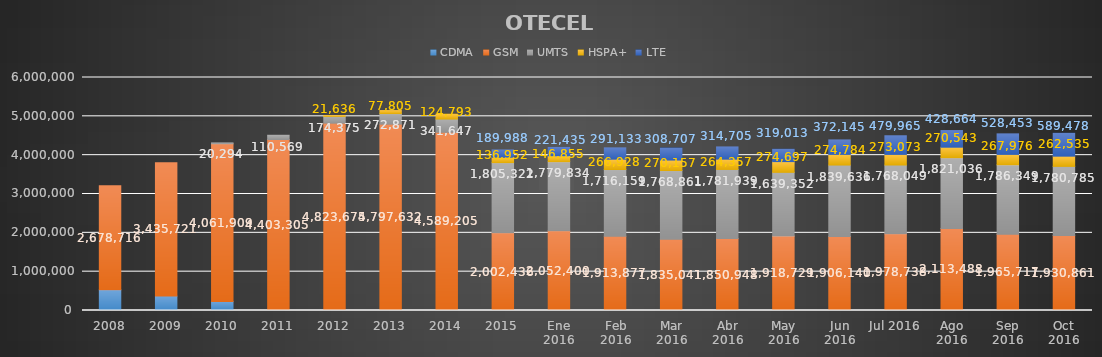
| Category | CDMA | GSM | UMTS | HSPA+ | LTE |
|---|---|---|---|---|---|
| 2008 | 533206 | 2678716 | 0 | 0 | 0 |
| 2009 | 370711 | 3435721 | 0 | 0 | 0 |
| 2010 | 232396 | 4061909 | 20294 | 0 | 0 |
| 2011 | 0 | 4403305 | 110569 | 0 | 0 |
| 2012 | 0 | 4823675 | 174375 | 21636 | 0 |
| 2013 | 0 | 4797632 | 272871 | 77805 | 0 |
| 2014 | 0 | 4589205 | 341647 | 124793 | 0 |
| 2015 | 0 | 2002436 | 1805322 | 136952 | 189988 |
| Ene 2016 | 0 | 2052400 | 1779834 | 146855 | 221435 |
| Feb 2016 | 0 | 1913877 | 1716159 | 266928 | 291133 |
| Mar 2016 | 0 | 1835041 | 1768861 | 270157 | 308707 |
| Abr 2016 | 0 | 1850948 | 1781939 | 264357 | 314705 |
| May 2016 | 0 | 1918729 | 1639352 | 274697 | 319013 |
| Jun 2016 | 0 | 1906140 | 1839636 | 274784 | 372145 |
| Jul 2016 | 0 | 1978738 | 1768049 | 273073 | 479965 |
| Ago 2016 | 0 | 2113488 | 1821036 | 270543 | 428664 |
| Sep 2016 | 0 | 1965717 | 1786349 | 267976 | 528453 |
| Oct 2016 | 0 | 1930861 | 1780785 | 262535 | 589478 |